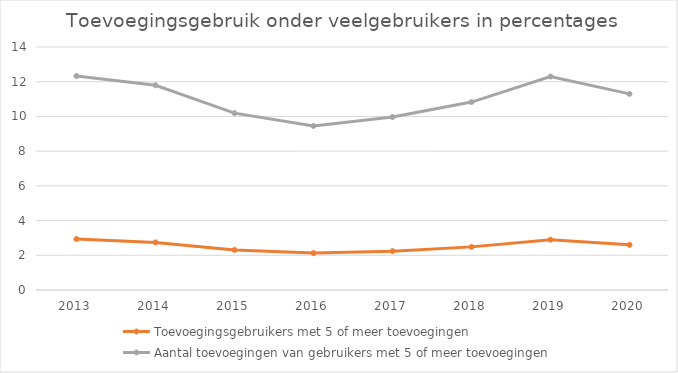
| Category | Toevoegingsgebruikers met 5 of meer toevoegingen | Aantal toevoegingen van gebruikers met 5 of meer toevoegingen |
|---|---|---|
| 2013.0 | 2.939 | 12.328 |
| 2014.0 | 2.742 | 11.795 |
| 2015.0 | 2.309 | 10.191 |
| 2016.0 | 2.125 | 9.452 |
| 2017.0 | 2.238 | 9.967 |
| 2018.0 | 2.485 | 10.827 |
| 2019.0 | 2.9 | 12.3 |
| 2020.0 | 2.6 | 11.3 |